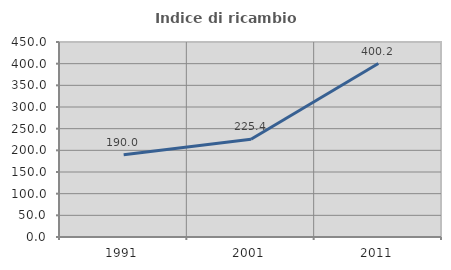
| Category | Indice di ricambio occupazionale  |
|---|---|
| 1991.0 | 190.05 |
| 2001.0 | 225.432 |
| 2011.0 | 400.225 |